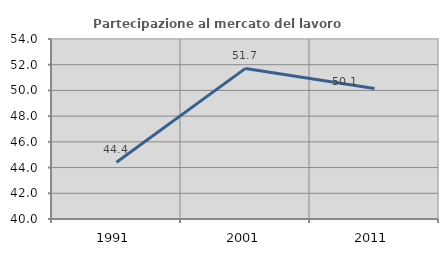
| Category | Partecipazione al mercato del lavoro  femminile |
|---|---|
| 1991.0 | 44.408 |
| 2001.0 | 51.713 |
| 2011.0 | 50.143 |